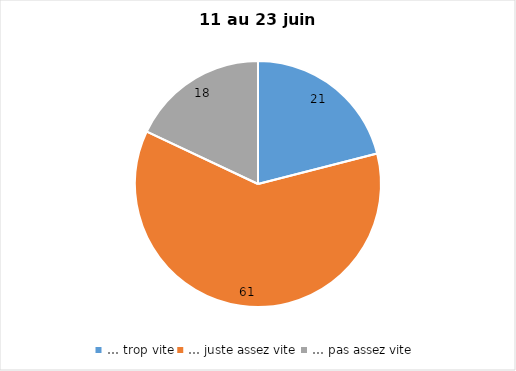
| Category | Series 0 |
|---|---|
| … trop vite | 21 |
| … juste assez vite | 61 |
| … pas assez vite | 18 |